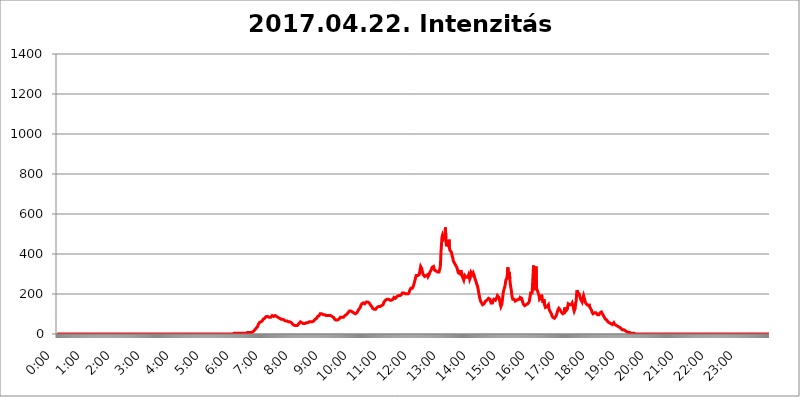
| Category | 2017.04.22. Intenzitás [W/m^2] |
|---|---|
| 0.0 | 0 |
| 0.0006944444444444445 | 0 |
| 0.001388888888888889 | 0 |
| 0.0020833333333333333 | 0 |
| 0.002777777777777778 | 0 |
| 0.003472222222222222 | 0 |
| 0.004166666666666667 | 0 |
| 0.004861111111111111 | 0 |
| 0.005555555555555556 | 0 |
| 0.0062499999999999995 | 0 |
| 0.006944444444444444 | 0 |
| 0.007638888888888889 | 0 |
| 0.008333333333333333 | 0 |
| 0.009027777777777779 | 0 |
| 0.009722222222222222 | 0 |
| 0.010416666666666666 | 0 |
| 0.011111111111111112 | 0 |
| 0.011805555555555555 | 0 |
| 0.012499999999999999 | 0 |
| 0.013194444444444444 | 0 |
| 0.013888888888888888 | 0 |
| 0.014583333333333332 | 0 |
| 0.015277777777777777 | 0 |
| 0.015972222222222224 | 0 |
| 0.016666666666666666 | 0 |
| 0.017361111111111112 | 0 |
| 0.018055555555555557 | 0 |
| 0.01875 | 0 |
| 0.019444444444444445 | 0 |
| 0.02013888888888889 | 0 |
| 0.020833333333333332 | 0 |
| 0.02152777777777778 | 0 |
| 0.022222222222222223 | 0 |
| 0.02291666666666667 | 0 |
| 0.02361111111111111 | 0 |
| 0.024305555555555556 | 0 |
| 0.024999999999999998 | 0 |
| 0.025694444444444447 | 0 |
| 0.02638888888888889 | 0 |
| 0.027083333333333334 | 0 |
| 0.027777777777777776 | 0 |
| 0.02847222222222222 | 0 |
| 0.029166666666666664 | 0 |
| 0.029861111111111113 | 0 |
| 0.030555555555555555 | 0 |
| 0.03125 | 0 |
| 0.03194444444444445 | 0 |
| 0.03263888888888889 | 0 |
| 0.03333333333333333 | 0 |
| 0.034027777777777775 | 0 |
| 0.034722222222222224 | 0 |
| 0.035416666666666666 | 0 |
| 0.036111111111111115 | 0 |
| 0.03680555555555556 | 0 |
| 0.0375 | 0 |
| 0.03819444444444444 | 0 |
| 0.03888888888888889 | 0 |
| 0.03958333333333333 | 0 |
| 0.04027777777777778 | 0 |
| 0.04097222222222222 | 0 |
| 0.041666666666666664 | 0 |
| 0.042361111111111106 | 0 |
| 0.04305555555555556 | 0 |
| 0.043750000000000004 | 0 |
| 0.044444444444444446 | 0 |
| 0.04513888888888889 | 0 |
| 0.04583333333333334 | 0 |
| 0.04652777777777778 | 0 |
| 0.04722222222222222 | 0 |
| 0.04791666666666666 | 0 |
| 0.04861111111111111 | 0 |
| 0.049305555555555554 | 0 |
| 0.049999999999999996 | 0 |
| 0.05069444444444445 | 0 |
| 0.051388888888888894 | 0 |
| 0.052083333333333336 | 0 |
| 0.05277777777777778 | 0 |
| 0.05347222222222222 | 0 |
| 0.05416666666666667 | 0 |
| 0.05486111111111111 | 0 |
| 0.05555555555555555 | 0 |
| 0.05625 | 0 |
| 0.05694444444444444 | 0 |
| 0.057638888888888885 | 0 |
| 0.05833333333333333 | 0 |
| 0.05902777777777778 | 0 |
| 0.059722222222222225 | 0 |
| 0.06041666666666667 | 0 |
| 0.061111111111111116 | 0 |
| 0.06180555555555556 | 0 |
| 0.0625 | 0 |
| 0.06319444444444444 | 0 |
| 0.06388888888888888 | 0 |
| 0.06458333333333334 | 0 |
| 0.06527777777777778 | 0 |
| 0.06597222222222222 | 0 |
| 0.06666666666666667 | 0 |
| 0.06736111111111111 | 0 |
| 0.06805555555555555 | 0 |
| 0.06874999999999999 | 0 |
| 0.06944444444444443 | 0 |
| 0.07013888888888889 | 0 |
| 0.07083333333333333 | 0 |
| 0.07152777777777779 | 0 |
| 0.07222222222222223 | 0 |
| 0.07291666666666667 | 0 |
| 0.07361111111111111 | 0 |
| 0.07430555555555556 | 0 |
| 0.075 | 0 |
| 0.07569444444444444 | 0 |
| 0.0763888888888889 | 0 |
| 0.07708333333333334 | 0 |
| 0.07777777777777778 | 0 |
| 0.07847222222222222 | 0 |
| 0.07916666666666666 | 0 |
| 0.0798611111111111 | 0 |
| 0.08055555555555556 | 0 |
| 0.08125 | 0 |
| 0.08194444444444444 | 0 |
| 0.08263888888888889 | 0 |
| 0.08333333333333333 | 0 |
| 0.08402777777777777 | 0 |
| 0.08472222222222221 | 0 |
| 0.08541666666666665 | 0 |
| 0.08611111111111112 | 0 |
| 0.08680555555555557 | 0 |
| 0.08750000000000001 | 0 |
| 0.08819444444444445 | 0 |
| 0.08888888888888889 | 0 |
| 0.08958333333333333 | 0 |
| 0.09027777777777778 | 0 |
| 0.09097222222222222 | 0 |
| 0.09166666666666667 | 0 |
| 0.09236111111111112 | 0 |
| 0.09305555555555556 | 0 |
| 0.09375 | 0 |
| 0.09444444444444444 | 0 |
| 0.09513888888888888 | 0 |
| 0.09583333333333333 | 0 |
| 0.09652777777777777 | 0 |
| 0.09722222222222222 | 0 |
| 0.09791666666666667 | 0 |
| 0.09861111111111111 | 0 |
| 0.09930555555555555 | 0 |
| 0.09999999999999999 | 0 |
| 0.10069444444444443 | 0 |
| 0.1013888888888889 | 0 |
| 0.10208333333333335 | 0 |
| 0.10277777777777779 | 0 |
| 0.10347222222222223 | 0 |
| 0.10416666666666667 | 0 |
| 0.10486111111111111 | 0 |
| 0.10555555555555556 | 0 |
| 0.10625 | 0 |
| 0.10694444444444444 | 0 |
| 0.1076388888888889 | 0 |
| 0.10833333333333334 | 0 |
| 0.10902777777777778 | 0 |
| 0.10972222222222222 | 0 |
| 0.1111111111111111 | 0 |
| 0.11180555555555556 | 0 |
| 0.11180555555555556 | 0 |
| 0.1125 | 0 |
| 0.11319444444444444 | 0 |
| 0.11388888888888889 | 0 |
| 0.11458333333333333 | 0 |
| 0.11527777777777777 | 0 |
| 0.11597222222222221 | 0 |
| 0.11666666666666665 | 0 |
| 0.1173611111111111 | 0 |
| 0.11805555555555557 | 0 |
| 0.11944444444444445 | 0 |
| 0.12013888888888889 | 0 |
| 0.12083333333333333 | 0 |
| 0.12152777777777778 | 0 |
| 0.12222222222222223 | 0 |
| 0.12291666666666667 | 0 |
| 0.12291666666666667 | 0 |
| 0.12361111111111112 | 0 |
| 0.12430555555555556 | 0 |
| 0.125 | 0 |
| 0.12569444444444444 | 0 |
| 0.12638888888888888 | 0 |
| 0.12708333333333333 | 0 |
| 0.16875 | 0 |
| 0.12847222222222224 | 0 |
| 0.12916666666666668 | 0 |
| 0.12986111111111112 | 0 |
| 0.13055555555555556 | 0 |
| 0.13125 | 0 |
| 0.13194444444444445 | 0 |
| 0.1326388888888889 | 0 |
| 0.13333333333333333 | 0 |
| 0.13402777777777777 | 0 |
| 0.13402777777777777 | 0 |
| 0.13472222222222222 | 0 |
| 0.13541666666666666 | 0 |
| 0.1361111111111111 | 0 |
| 0.13749999999999998 | 0 |
| 0.13819444444444443 | 0 |
| 0.1388888888888889 | 0 |
| 0.13958333333333334 | 0 |
| 0.14027777777777778 | 0 |
| 0.14097222222222222 | 0 |
| 0.14166666666666666 | 0 |
| 0.1423611111111111 | 0 |
| 0.14305555555555557 | 0 |
| 0.14375000000000002 | 0 |
| 0.14444444444444446 | 0 |
| 0.1451388888888889 | 0 |
| 0.1451388888888889 | 0 |
| 0.14652777777777778 | 0 |
| 0.14722222222222223 | 0 |
| 0.14791666666666667 | 0 |
| 0.1486111111111111 | 0 |
| 0.14930555555555555 | 0 |
| 0.15 | 0 |
| 0.15069444444444444 | 0 |
| 0.15138888888888888 | 0 |
| 0.15208333333333332 | 0 |
| 0.15277777777777776 | 0 |
| 0.15347222222222223 | 0 |
| 0.15416666666666667 | 0 |
| 0.15486111111111112 | 0 |
| 0.15555555555555556 | 0 |
| 0.15625 | 0 |
| 0.15694444444444444 | 0 |
| 0.15763888888888888 | 0 |
| 0.15833333333333333 | 0 |
| 0.15902777777777777 | 0 |
| 0.15972222222222224 | 0 |
| 0.16041666666666668 | 0 |
| 0.16111111111111112 | 0 |
| 0.16180555555555556 | 0 |
| 0.1625 | 0 |
| 0.16319444444444445 | 0 |
| 0.1638888888888889 | 0 |
| 0.16458333333333333 | 0 |
| 0.16527777777777777 | 0 |
| 0.16597222222222222 | 0 |
| 0.16666666666666666 | 0 |
| 0.1673611111111111 | 0 |
| 0.16805555555555554 | 0 |
| 0.16874999999999998 | 0 |
| 0.16944444444444443 | 0 |
| 0.17013888888888887 | 0 |
| 0.1708333333333333 | 0 |
| 0.17152777777777775 | 0 |
| 0.17222222222222225 | 0 |
| 0.1729166666666667 | 0 |
| 0.17361111111111113 | 0 |
| 0.17430555555555557 | 0 |
| 0.17500000000000002 | 0 |
| 0.17569444444444446 | 0 |
| 0.1763888888888889 | 0 |
| 0.17708333333333334 | 0 |
| 0.17777777777777778 | 0 |
| 0.17847222222222223 | 0 |
| 0.17916666666666667 | 0 |
| 0.1798611111111111 | 0 |
| 0.18055555555555555 | 0 |
| 0.18125 | 0 |
| 0.18194444444444444 | 0 |
| 0.1826388888888889 | 0 |
| 0.18333333333333335 | 0 |
| 0.1840277777777778 | 0 |
| 0.18472222222222223 | 0 |
| 0.18541666666666667 | 0 |
| 0.18611111111111112 | 0 |
| 0.18680555555555556 | 0 |
| 0.1875 | 0 |
| 0.18819444444444444 | 0 |
| 0.18888888888888888 | 0 |
| 0.18958333333333333 | 0 |
| 0.19027777777777777 | 0 |
| 0.1909722222222222 | 0 |
| 0.19166666666666665 | 0 |
| 0.19236111111111112 | 0 |
| 0.19305555555555554 | 0 |
| 0.19375 | 0 |
| 0.19444444444444445 | 0 |
| 0.1951388888888889 | 0 |
| 0.19583333333333333 | 0 |
| 0.19652777777777777 | 0 |
| 0.19722222222222222 | 0 |
| 0.19791666666666666 | 0 |
| 0.1986111111111111 | 0 |
| 0.19930555555555554 | 0 |
| 0.19999999999999998 | 0 |
| 0.20069444444444443 | 0 |
| 0.20138888888888887 | 0 |
| 0.2020833333333333 | 0 |
| 0.2027777777777778 | 0 |
| 0.2034722222222222 | 0 |
| 0.2041666666666667 | 0 |
| 0.20486111111111113 | 0 |
| 0.20555555555555557 | 0 |
| 0.20625000000000002 | 0 |
| 0.20694444444444446 | 0 |
| 0.2076388888888889 | 0 |
| 0.20833333333333334 | 0 |
| 0.20902777777777778 | 0 |
| 0.20972222222222223 | 0 |
| 0.21041666666666667 | 0 |
| 0.2111111111111111 | 0 |
| 0.21180555555555555 | 0 |
| 0.2125 | 0 |
| 0.21319444444444444 | 0 |
| 0.2138888888888889 | 0 |
| 0.21458333333333335 | 0 |
| 0.2152777777777778 | 0 |
| 0.21597222222222223 | 0 |
| 0.21666666666666667 | 0 |
| 0.21736111111111112 | 0 |
| 0.21805555555555556 | 0 |
| 0.21875 | 0 |
| 0.21944444444444444 | 0 |
| 0.22013888888888888 | 0 |
| 0.22083333333333333 | 0 |
| 0.22152777777777777 | 0 |
| 0.2222222222222222 | 0 |
| 0.22291666666666665 | 0 |
| 0.2236111111111111 | 0 |
| 0.22430555555555556 | 0 |
| 0.225 | 0 |
| 0.22569444444444445 | 0 |
| 0.2263888888888889 | 0 |
| 0.22708333333333333 | 0 |
| 0.22777777777777777 | 0 |
| 0.22847222222222222 | 0 |
| 0.22916666666666666 | 0 |
| 0.2298611111111111 | 0 |
| 0.23055555555555554 | 0 |
| 0.23124999999999998 | 0 |
| 0.23194444444444443 | 0 |
| 0.23263888888888887 | 0 |
| 0.2333333333333333 | 0 |
| 0.2340277777777778 | 0 |
| 0.2347222222222222 | 0 |
| 0.2354166666666667 | 0 |
| 0.23611111111111113 | 0 |
| 0.23680555555555557 | 0 |
| 0.23750000000000002 | 0 |
| 0.23819444444444446 | 0 |
| 0.2388888888888889 | 0 |
| 0.23958333333333334 | 0 |
| 0.24027777777777778 | 0 |
| 0.24097222222222223 | 0 |
| 0.24166666666666667 | 0 |
| 0.2423611111111111 | 0 |
| 0.24305555555555555 | 0 |
| 0.24375 | 0 |
| 0.24444444444444446 | 0 |
| 0.24513888888888888 | 0 |
| 0.24583333333333335 | 0 |
| 0.2465277777777778 | 3.525 |
| 0.24722222222222223 | 3.525 |
| 0.24791666666666667 | 3.525 |
| 0.24861111111111112 | 3.525 |
| 0.24930555555555556 | 3.525 |
| 0.25 | 3.525 |
| 0.25069444444444444 | 3.525 |
| 0.2513888888888889 | 3.525 |
| 0.2520833333333333 | 3.525 |
| 0.25277777777777777 | 3.525 |
| 0.2534722222222222 | 3.525 |
| 0.25416666666666665 | 3.525 |
| 0.2548611111111111 | 3.525 |
| 0.2555555555555556 | 3.525 |
| 0.25625000000000003 | 3.525 |
| 0.2569444444444445 | 3.525 |
| 0.2576388888888889 | 3.525 |
| 0.25833333333333336 | 3.525 |
| 0.2590277777777778 | 3.525 |
| 0.25972222222222224 | 3.525 |
| 0.2604166666666667 | 3.525 |
| 0.2611111111111111 | 3.525 |
| 0.26180555555555557 | 3.525 |
| 0.2625 | 3.525 |
| 0.26319444444444445 | 7.887 |
| 0.2638888888888889 | 7.887 |
| 0.26458333333333334 | 3.525 |
| 0.2652777777777778 | 7.887 |
| 0.2659722222222222 | 7.887 |
| 0.26666666666666666 | 7.887 |
| 0.2673611111111111 | 7.887 |
| 0.26805555555555555 | 7.887 |
| 0.26875 | 7.887 |
| 0.26944444444444443 | 7.887 |
| 0.2701388888888889 | 7.887 |
| 0.2708333333333333 | 7.887 |
| 0.27152777777777776 | 7.887 |
| 0.2722222222222222 | 7.887 |
| 0.27291666666666664 | 7.887 |
| 0.2736111111111111 | 12.257 |
| 0.2743055555555555 | 12.257 |
| 0.27499999999999997 | 12.257 |
| 0.27569444444444446 | 12.257 |
| 0.27638888888888885 | 16.636 |
| 0.27708333333333335 | 21.024 |
| 0.2777777777777778 | 25.419 |
| 0.27847222222222223 | 25.419 |
| 0.2791666666666667 | 29.823 |
| 0.2798611111111111 | 34.234 |
| 0.28055555555555556 | 34.234 |
| 0.28125 | 38.653 |
| 0.28194444444444444 | 47.511 |
| 0.2826388888888889 | 51.951 |
| 0.2833333333333333 | 56.398 |
| 0.28402777777777777 | 56.398 |
| 0.2847222222222222 | 56.398 |
| 0.28541666666666665 | 60.85 |
| 0.28611111111111115 | 60.85 |
| 0.28680555555555554 | 60.85 |
| 0.28750000000000003 | 65.31 |
| 0.2881944444444445 | 65.31 |
| 0.2888888888888889 | 74.246 |
| 0.28958333333333336 | 74.246 |
| 0.2902777777777778 | 74.246 |
| 0.29097222222222224 | 78.722 |
| 0.2916666666666667 | 83.205 |
| 0.2923611111111111 | 83.205 |
| 0.29305555555555557 | 87.692 |
| 0.29375 | 87.692 |
| 0.29444444444444445 | 87.692 |
| 0.2951388888888889 | 87.692 |
| 0.29583333333333334 | 87.692 |
| 0.2965277777777778 | 83.205 |
| 0.2972222222222222 | 83.205 |
| 0.29791666666666666 | 83.205 |
| 0.2986111111111111 | 83.205 |
| 0.29930555555555555 | 83.205 |
| 0.3 | 87.692 |
| 0.30069444444444443 | 87.692 |
| 0.3013888888888889 | 92.184 |
| 0.3020833333333333 | 87.692 |
| 0.30277777777777776 | 87.692 |
| 0.3034722222222222 | 87.692 |
| 0.30416666666666664 | 87.692 |
| 0.3048611111111111 | 87.692 |
| 0.3055555555555555 | 92.184 |
| 0.30624999999999997 | 87.692 |
| 0.3069444444444444 | 87.692 |
| 0.3076388888888889 | 87.692 |
| 0.30833333333333335 | 83.205 |
| 0.3090277777777778 | 83.205 |
| 0.30972222222222223 | 83.205 |
| 0.3104166666666667 | 83.205 |
| 0.3111111111111111 | 83.205 |
| 0.31180555555555556 | 78.722 |
| 0.3125 | 78.722 |
| 0.31319444444444444 | 78.722 |
| 0.3138888888888889 | 74.246 |
| 0.3145833333333333 | 74.246 |
| 0.31527777777777777 | 74.246 |
| 0.3159722222222222 | 74.246 |
| 0.31666666666666665 | 74.246 |
| 0.31736111111111115 | 74.246 |
| 0.31805555555555554 | 69.775 |
| 0.31875000000000003 | 65.31 |
| 0.3194444444444445 | 65.31 |
| 0.3201388888888889 | 65.31 |
| 0.32083333333333336 | 65.31 |
| 0.3215277777777778 | 65.31 |
| 0.32222222222222224 | 65.31 |
| 0.3229166666666667 | 65.31 |
| 0.3236111111111111 | 60.85 |
| 0.32430555555555557 | 60.85 |
| 0.325 | 60.85 |
| 0.32569444444444445 | 60.85 |
| 0.3263888888888889 | 60.85 |
| 0.32708333333333334 | 60.85 |
| 0.3277777777777778 | 60.85 |
| 0.3284722222222222 | 56.398 |
| 0.32916666666666666 | 56.398 |
| 0.3298611111111111 | 51.951 |
| 0.33055555555555555 | 47.511 |
| 0.33125 | 47.511 |
| 0.33194444444444443 | 43.079 |
| 0.3326388888888889 | 43.079 |
| 0.3333333333333333 | 43.079 |
| 0.3340277777777778 | 43.079 |
| 0.3347222222222222 | 43.079 |
| 0.3354166666666667 | 43.079 |
| 0.3361111111111111 | 43.079 |
| 0.3368055555555556 | 43.079 |
| 0.33749999999999997 | 47.511 |
| 0.33819444444444446 | 47.511 |
| 0.33888888888888885 | 51.951 |
| 0.33958333333333335 | 56.398 |
| 0.34027777777777773 | 56.398 |
| 0.34097222222222223 | 60.85 |
| 0.3416666666666666 | 60.85 |
| 0.3423611111111111 | 60.85 |
| 0.3430555555555555 | 56.398 |
| 0.34375 | 56.398 |
| 0.3444444444444445 | 51.951 |
| 0.3451388888888889 | 51.951 |
| 0.3458333333333334 | 47.511 |
| 0.34652777777777777 | 47.511 |
| 0.34722222222222227 | 51.951 |
| 0.34791666666666665 | 51.951 |
| 0.34861111111111115 | 56.398 |
| 0.34930555555555554 | 56.398 |
| 0.35000000000000003 | 56.398 |
| 0.3506944444444444 | 56.398 |
| 0.3513888888888889 | 56.398 |
| 0.3520833333333333 | 56.398 |
| 0.3527777777777778 | 56.398 |
| 0.3534722222222222 | 60.85 |
| 0.3541666666666667 | 60.85 |
| 0.3548611111111111 | 60.85 |
| 0.35555555555555557 | 60.85 |
| 0.35625 | 60.85 |
| 0.35694444444444445 | 60.85 |
| 0.3576388888888889 | 60.85 |
| 0.35833333333333334 | 60.85 |
| 0.3590277777777778 | 65.31 |
| 0.3597222222222222 | 65.31 |
| 0.36041666666666666 | 69.775 |
| 0.3611111111111111 | 69.775 |
| 0.36180555555555555 | 74.246 |
| 0.3625 | 74.246 |
| 0.36319444444444443 | 74.246 |
| 0.3638888888888889 | 78.722 |
| 0.3645833333333333 | 83.205 |
| 0.3652777777777778 | 87.692 |
| 0.3659722222222222 | 87.692 |
| 0.3666666666666667 | 92.184 |
| 0.3673611111111111 | 92.184 |
| 0.3680555555555556 | 96.682 |
| 0.36874999999999997 | 101.184 |
| 0.36944444444444446 | 101.184 |
| 0.37013888888888885 | 101.184 |
| 0.37083333333333335 | 101.184 |
| 0.37152777777777773 | 96.682 |
| 0.37222222222222223 | 96.682 |
| 0.3729166666666666 | 96.682 |
| 0.3736111111111111 | 96.682 |
| 0.3743055555555555 | 96.682 |
| 0.375 | 96.682 |
| 0.3756944444444445 | 96.682 |
| 0.3763888888888889 | 92.184 |
| 0.3770833333333334 | 92.184 |
| 0.37777777777777777 | 92.184 |
| 0.37847222222222227 | 92.184 |
| 0.37916666666666665 | 92.184 |
| 0.37986111111111115 | 92.184 |
| 0.38055555555555554 | 92.184 |
| 0.38125000000000003 | 92.184 |
| 0.3819444444444444 | 92.184 |
| 0.3826388888888889 | 92.184 |
| 0.3833333333333333 | 92.184 |
| 0.3840277777777778 | 87.692 |
| 0.3847222222222222 | 87.692 |
| 0.3854166666666667 | 87.692 |
| 0.3861111111111111 | 83.205 |
| 0.38680555555555557 | 83.205 |
| 0.3875 | 83.205 |
| 0.38819444444444445 | 78.722 |
| 0.3888888888888889 | 74.246 |
| 0.38958333333333334 | 74.246 |
| 0.3902777777777778 | 74.246 |
| 0.3909722222222222 | 69.775 |
| 0.39166666666666666 | 69.775 |
| 0.3923611111111111 | 69.775 |
| 0.39305555555555555 | 69.775 |
| 0.39375 | 74.246 |
| 0.39444444444444443 | 74.246 |
| 0.3951388888888889 | 74.246 |
| 0.3958333333333333 | 78.722 |
| 0.3965277777777778 | 78.722 |
| 0.3972222222222222 | 83.205 |
| 0.3979166666666667 | 83.205 |
| 0.3986111111111111 | 83.205 |
| 0.3993055555555556 | 83.205 |
| 0.39999999999999997 | 83.205 |
| 0.40069444444444446 | 83.205 |
| 0.40138888888888885 | 83.205 |
| 0.40208333333333335 | 83.205 |
| 0.40277777777777773 | 87.692 |
| 0.40347222222222223 | 92.184 |
| 0.4041666666666666 | 92.184 |
| 0.4048611111111111 | 92.184 |
| 0.4055555555555555 | 96.682 |
| 0.40625 | 101.184 |
| 0.4069444444444445 | 101.184 |
| 0.4076388888888889 | 105.69 |
| 0.4083333333333334 | 105.69 |
| 0.40902777777777777 | 110.201 |
| 0.40972222222222227 | 114.716 |
| 0.41041666666666665 | 114.716 |
| 0.41111111111111115 | 114.716 |
| 0.41180555555555554 | 114.716 |
| 0.41250000000000003 | 110.201 |
| 0.4131944444444444 | 110.201 |
| 0.4138888888888889 | 110.201 |
| 0.4145833333333333 | 110.201 |
| 0.4152777777777778 | 110.201 |
| 0.4159722222222222 | 105.69 |
| 0.4166666666666667 | 105.69 |
| 0.4173611111111111 | 101.184 |
| 0.41805555555555557 | 101.184 |
| 0.41875 | 101.184 |
| 0.41944444444444445 | 101.184 |
| 0.4201388888888889 | 105.69 |
| 0.42083333333333334 | 110.201 |
| 0.4215277777777778 | 114.716 |
| 0.4222222222222222 | 119.235 |
| 0.42291666666666666 | 123.758 |
| 0.4236111111111111 | 128.284 |
| 0.42430555555555555 | 128.284 |
| 0.425 | 132.814 |
| 0.42569444444444443 | 141.884 |
| 0.4263888888888889 | 146.423 |
| 0.4270833333333333 | 150.964 |
| 0.4277777777777778 | 155.509 |
| 0.4284722222222222 | 155.509 |
| 0.4291666666666667 | 155.509 |
| 0.4298611111111111 | 150.964 |
| 0.4305555555555556 | 150.964 |
| 0.43124999999999997 | 150.964 |
| 0.43194444444444446 | 150.964 |
| 0.43263888888888885 | 155.509 |
| 0.43333333333333335 | 160.056 |
| 0.43402777777777773 | 160.056 |
| 0.43472222222222223 | 160.056 |
| 0.4354166666666666 | 160.056 |
| 0.4361111111111111 | 160.056 |
| 0.4368055555555555 | 155.509 |
| 0.4375 | 155.509 |
| 0.4381944444444445 | 150.964 |
| 0.4388888888888889 | 146.423 |
| 0.4395833333333334 | 141.884 |
| 0.44027777777777777 | 141.884 |
| 0.44097222222222227 | 137.347 |
| 0.44166666666666665 | 132.814 |
| 0.44236111111111115 | 128.284 |
| 0.44305555555555554 | 123.758 |
| 0.44375000000000003 | 123.758 |
| 0.4444444444444444 | 123.758 |
| 0.4451388888888889 | 123.758 |
| 0.4458333333333333 | 119.235 |
| 0.4465277777777778 | 123.758 |
| 0.4472222222222222 | 123.758 |
| 0.4479166666666667 | 128.284 |
| 0.4486111111111111 | 132.814 |
| 0.44930555555555557 | 132.814 |
| 0.45 | 137.347 |
| 0.45069444444444445 | 137.347 |
| 0.4513888888888889 | 137.347 |
| 0.45208333333333334 | 137.347 |
| 0.4527777777777778 | 137.347 |
| 0.4534722222222222 | 137.347 |
| 0.45416666666666666 | 141.884 |
| 0.4548611111111111 | 141.884 |
| 0.45555555555555555 | 146.423 |
| 0.45625 | 146.423 |
| 0.45694444444444443 | 146.423 |
| 0.4576388888888889 | 150.964 |
| 0.4583333333333333 | 160.056 |
| 0.4590277777777778 | 164.605 |
| 0.4597222222222222 | 164.605 |
| 0.4604166666666667 | 169.156 |
| 0.4611111111111111 | 173.709 |
| 0.4618055555555556 | 173.709 |
| 0.46249999999999997 | 173.709 |
| 0.46319444444444446 | 173.709 |
| 0.46388888888888885 | 173.709 |
| 0.46458333333333335 | 173.709 |
| 0.46527777777777773 | 173.709 |
| 0.46597222222222223 | 169.156 |
| 0.4666666666666666 | 169.156 |
| 0.4673611111111111 | 169.156 |
| 0.4680555555555555 | 169.156 |
| 0.46875 | 169.156 |
| 0.4694444444444445 | 169.156 |
| 0.4701388888888889 | 173.709 |
| 0.4708333333333334 | 173.709 |
| 0.47152777777777777 | 178.264 |
| 0.47222222222222227 | 182.82 |
| 0.47291666666666665 | 182.82 |
| 0.47361111111111115 | 182.82 |
| 0.47430555555555554 | 178.264 |
| 0.47500000000000003 | 178.264 |
| 0.4756944444444444 | 182.82 |
| 0.4763888888888889 | 187.378 |
| 0.4770833333333333 | 191.937 |
| 0.4777777777777778 | 191.937 |
| 0.4784722222222222 | 191.937 |
| 0.4791666666666667 | 191.937 |
| 0.4798611111111111 | 191.937 |
| 0.48055555555555557 | 191.937 |
| 0.48125 | 191.937 |
| 0.48194444444444445 | 196.497 |
| 0.4826388888888889 | 196.497 |
| 0.48333333333333334 | 201.058 |
| 0.4840277777777778 | 205.62 |
| 0.4847222222222222 | 205.62 |
| 0.48541666666666666 | 205.62 |
| 0.4861111111111111 | 205.62 |
| 0.48680555555555555 | 205.62 |
| 0.4875 | 201.058 |
| 0.48819444444444443 | 201.058 |
| 0.4888888888888889 | 201.058 |
| 0.4895833333333333 | 201.058 |
| 0.4902777777777778 | 201.058 |
| 0.4909722222222222 | 201.058 |
| 0.4916666666666667 | 201.058 |
| 0.4923611111111111 | 201.058 |
| 0.4930555555555556 | 205.62 |
| 0.49374999999999997 | 210.182 |
| 0.49444444444444446 | 219.309 |
| 0.49513888888888885 | 223.873 |
| 0.49583333333333335 | 228.436 |
| 0.49652777777777773 | 228.436 |
| 0.49722222222222223 | 228.436 |
| 0.4979166666666666 | 228.436 |
| 0.4986111111111111 | 228.436 |
| 0.4993055555555555 | 237.564 |
| 0.5 | 246.689 |
| 0.5006944444444444 | 255.813 |
| 0.5013888888888889 | 264.932 |
| 0.5020833333333333 | 274.047 |
| 0.5027777777777778 | 283.156 |
| 0.5034722222222222 | 292.259 |
| 0.5041666666666667 | 296.808 |
| 0.5048611111111111 | 296.808 |
| 0.5055555555555555 | 292.259 |
| 0.50625 | 287.709 |
| 0.5069444444444444 | 292.259 |
| 0.5076388888888889 | 296.808 |
| 0.5083333333333333 | 310.44 |
| 0.5090277777777777 | 324.052 |
| 0.5097222222222222 | 337.639 |
| 0.5104166666666666 | 342.162 |
| 0.5111111111111112 | 328.584 |
| 0.5118055555555555 | 314.98 |
| 0.5125000000000001 | 305.898 |
| 0.5131944444444444 | 296.808 |
| 0.513888888888889 | 292.259 |
| 0.5145833333333333 | 292.259 |
| 0.5152777777777778 | 287.709 |
| 0.5159722222222222 | 287.709 |
| 0.5166666666666667 | 292.259 |
| 0.517361111111111 | 292.259 |
| 0.5180555555555556 | 292.259 |
| 0.5187499999999999 | 296.808 |
| 0.5194444444444445 | 296.808 |
| 0.5201388888888888 | 287.709 |
| 0.5208333333333334 | 287.709 |
| 0.5215277777777778 | 296.808 |
| 0.5222222222222223 | 305.898 |
| 0.5229166666666667 | 310.44 |
| 0.5236111111111111 | 314.98 |
| 0.5243055555555556 | 319.517 |
| 0.525 | 324.052 |
| 0.5256944444444445 | 333.113 |
| 0.5263888888888889 | 333.113 |
| 0.5270833333333333 | 333.113 |
| 0.5277777777777778 | 337.639 |
| 0.5284722222222222 | 328.584 |
| 0.5291666666666667 | 319.517 |
| 0.5298611111111111 | 314.98 |
| 0.5305555555555556 | 314.98 |
| 0.53125 | 314.98 |
| 0.5319444444444444 | 310.44 |
| 0.5326388888888889 | 310.44 |
| 0.5333333333333333 | 310.44 |
| 0.5340277777777778 | 310.44 |
| 0.5347222222222222 | 310.44 |
| 0.5354166666666667 | 310.44 |
| 0.5361111111111111 | 319.517 |
| 0.5368055555555555 | 328.584 |
| 0.5375 | 346.682 |
| 0.5381944444444444 | 409.574 |
| 0.5388888888888889 | 445.129 |
| 0.5395833333333333 | 484.735 |
| 0.5402777777777777 | 493.475 |
| 0.5409722222222222 | 484.735 |
| 0.5416666666666666 | 497.836 |
| 0.5423611111111112 | 484.735 |
| 0.5430555555555555 | 480.356 |
| 0.5437500000000001 | 497.836 |
| 0.5444444444444444 | 532.513 |
| 0.545138888888889 | 462.786 |
| 0.5458333333333333 | 445.129 |
| 0.5465277777777778 | 440.702 |
| 0.5472222222222222 | 440.702 |
| 0.5479166666666667 | 445.129 |
| 0.548611111111111 | 436.27 |
| 0.5493055555555556 | 471.582 |
| 0.5499999999999999 | 431.833 |
| 0.5506944444444445 | 418.492 |
| 0.5513888888888888 | 418.492 |
| 0.5520833333333334 | 414.035 |
| 0.5527777777777778 | 409.574 |
| 0.5534722222222223 | 405.108 |
| 0.5541666666666667 | 387.202 |
| 0.5548611111111111 | 378.224 |
| 0.5555555555555556 | 364.728 |
| 0.55625 | 360.221 |
| 0.5569444444444445 | 355.712 |
| 0.5576388888888889 | 351.198 |
| 0.5583333333333333 | 346.682 |
| 0.5590277777777778 | 346.682 |
| 0.5597222222222222 | 342.162 |
| 0.5604166666666667 | 333.113 |
| 0.5611111111111111 | 324.052 |
| 0.5618055555555556 | 314.98 |
| 0.5625 | 305.898 |
| 0.5631944444444444 | 301.354 |
| 0.5638888888888889 | 301.354 |
| 0.5645833333333333 | 301.354 |
| 0.5652777777777778 | 296.808 |
| 0.5659722222222222 | 319.517 |
| 0.5666666666666667 | 314.98 |
| 0.5673611111111111 | 296.808 |
| 0.5680555555555555 | 287.709 |
| 0.56875 | 287.709 |
| 0.5694444444444444 | 287.709 |
| 0.5701388888888889 | 269.49 |
| 0.5708333333333333 | 274.047 |
| 0.5715277777777777 | 292.259 |
| 0.5722222222222222 | 296.808 |
| 0.5729166666666666 | 287.709 |
| 0.5736111111111112 | 283.156 |
| 0.5743055555555555 | 287.709 |
| 0.5750000000000001 | 287.709 |
| 0.5756944444444444 | 283.156 |
| 0.576388888888889 | 287.709 |
| 0.5770833333333333 | 296.808 |
| 0.5777777777777778 | 287.709 |
| 0.5784722222222222 | 274.047 |
| 0.5791666666666667 | 269.49 |
| 0.579861111111111 | 287.709 |
| 0.5805555555555556 | 305.898 |
| 0.5812499999999999 | 305.898 |
| 0.5819444444444445 | 296.808 |
| 0.5826388888888888 | 301.354 |
| 0.5833333333333334 | 305.898 |
| 0.5840277777777778 | 301.354 |
| 0.5847222222222223 | 292.259 |
| 0.5854166666666667 | 283.156 |
| 0.5861111111111111 | 274.047 |
| 0.5868055555555556 | 269.49 |
| 0.5875 | 260.373 |
| 0.5881944444444445 | 251.251 |
| 0.5888888888888889 | 246.689 |
| 0.5895833333333333 | 237.564 |
| 0.5902777777777778 | 223.873 |
| 0.5909722222222222 | 210.182 |
| 0.5916666666666667 | 196.497 |
| 0.5923611111111111 | 182.82 |
| 0.5930555555555556 | 173.709 |
| 0.59375 | 164.605 |
| 0.5944444444444444 | 160.056 |
| 0.5951388888888889 | 155.509 |
| 0.5958333333333333 | 150.964 |
| 0.5965277777777778 | 146.423 |
| 0.5972222222222222 | 150.964 |
| 0.5979166666666667 | 150.964 |
| 0.5986111111111111 | 150.964 |
| 0.5993055555555555 | 155.509 |
| 0.6 | 155.509 |
| 0.6006944444444444 | 164.605 |
| 0.6013888888888889 | 164.605 |
| 0.6020833333333333 | 169.156 |
| 0.6027777777777777 | 169.156 |
| 0.6034722222222222 | 169.156 |
| 0.6041666666666666 | 173.709 |
| 0.6048611111111112 | 178.264 |
| 0.6055555555555555 | 182.82 |
| 0.6062500000000001 | 178.264 |
| 0.6069444444444444 | 173.709 |
| 0.607638888888889 | 164.605 |
| 0.6083333333333333 | 155.509 |
| 0.6090277777777778 | 150.964 |
| 0.6097222222222222 | 150.964 |
| 0.6104166666666667 | 155.509 |
| 0.611111111111111 | 164.605 |
| 0.6118055555555556 | 169.156 |
| 0.6124999999999999 | 173.709 |
| 0.6131944444444445 | 173.709 |
| 0.6138888888888888 | 169.156 |
| 0.6145833333333334 | 169.156 |
| 0.6152777777777778 | 173.709 |
| 0.6159722222222223 | 178.264 |
| 0.6166666666666667 | 182.82 |
| 0.6173611111111111 | 191.937 |
| 0.6180555555555556 | 196.497 |
| 0.61875 | 191.937 |
| 0.6194444444444445 | 182.82 |
| 0.6201388888888889 | 173.709 |
| 0.6208333333333333 | 160.056 |
| 0.6215277777777778 | 146.423 |
| 0.6222222222222222 | 137.347 |
| 0.6229166666666667 | 137.347 |
| 0.6236111111111111 | 150.964 |
| 0.6243055555555556 | 169.156 |
| 0.625 | 191.937 |
| 0.6256944444444444 | 210.182 |
| 0.6263888888888889 | 219.309 |
| 0.6270833333333333 | 223.873 |
| 0.6277777777777778 | 237.564 |
| 0.6284722222222222 | 251.251 |
| 0.6291666666666667 | 269.49 |
| 0.6298611111111111 | 264.932 |
| 0.6305555555555555 | 278.603 |
| 0.63125 | 296.808 |
| 0.6319444444444444 | 333.113 |
| 0.6326388888888889 | 305.898 |
| 0.6333333333333333 | 296.808 |
| 0.6340277777777777 | 310.44 |
| 0.6347222222222222 | 274.047 |
| 0.6354166666666666 | 251.251 |
| 0.6361111111111112 | 233 |
| 0.6368055555555555 | 219.309 |
| 0.6375000000000001 | 196.497 |
| 0.6381944444444444 | 182.82 |
| 0.638888888888889 | 173.709 |
| 0.6395833333333333 | 169.156 |
| 0.6402777777777778 | 169.156 |
| 0.6409722222222222 | 173.709 |
| 0.6416666666666667 | 169.156 |
| 0.642361111111111 | 164.605 |
| 0.6430555555555556 | 164.605 |
| 0.6437499999999999 | 164.605 |
| 0.6444444444444445 | 169.156 |
| 0.6451388888888888 | 169.156 |
| 0.6458333333333334 | 173.709 |
| 0.6465277777777778 | 173.709 |
| 0.6472222222222223 | 173.709 |
| 0.6479166666666667 | 173.709 |
| 0.6486111111111111 | 173.709 |
| 0.6493055555555556 | 182.82 |
| 0.65 | 182.82 |
| 0.6506944444444445 | 182.82 |
| 0.6513888888888889 | 178.264 |
| 0.6520833333333333 | 169.156 |
| 0.6527777777777778 | 160.056 |
| 0.6534722222222222 | 150.964 |
| 0.6541666666666667 | 146.423 |
| 0.6548611111111111 | 146.423 |
| 0.6555555555555556 | 141.884 |
| 0.65625 | 146.423 |
| 0.6569444444444444 | 146.423 |
| 0.6576388888888889 | 146.423 |
| 0.6583333333333333 | 146.423 |
| 0.6590277777777778 | 146.423 |
| 0.6597222222222222 | 150.964 |
| 0.6604166666666667 | 150.964 |
| 0.6611111111111111 | 155.509 |
| 0.6618055555555555 | 160.056 |
| 0.6625 | 173.709 |
| 0.6631944444444444 | 187.378 |
| 0.6638888888888889 | 205.62 |
| 0.6645833333333333 | 201.058 |
| 0.6652777777777777 | 201.058 |
| 0.6659722222222222 | 205.62 |
| 0.6666666666666666 | 205.62 |
| 0.6673611111111111 | 205.62 |
| 0.6680555555555556 | 342.162 |
| 0.6687500000000001 | 219.309 |
| 0.6694444444444444 | 228.436 |
| 0.6701388888888888 | 233 |
| 0.6708333333333334 | 228.436 |
| 0.6715277777777778 | 337.639 |
| 0.6722222222222222 | 228.436 |
| 0.6729166666666666 | 228.436 |
| 0.6736111111111112 | 214.746 |
| 0.6743055555555556 | 214.746 |
| 0.6749999999999999 | 210.182 |
| 0.6756944444444444 | 191.937 |
| 0.6763888888888889 | 173.709 |
| 0.6770833333333334 | 169.156 |
| 0.6777777777777777 | 169.156 |
| 0.6784722222222223 | 182.82 |
| 0.6791666666666667 | 196.497 |
| 0.6798611111111111 | 187.378 |
| 0.6805555555555555 | 169.156 |
| 0.68125 | 155.509 |
| 0.6819444444444445 | 155.509 |
| 0.6826388888888889 | 173.709 |
| 0.6833333333333332 | 146.423 |
| 0.6840277777777778 | 146.423 |
| 0.6847222222222222 | 132.814 |
| 0.6854166666666667 | 137.347 |
| 0.686111111111111 | 137.347 |
| 0.6868055555555556 | 137.347 |
| 0.6875 | 141.884 |
| 0.6881944444444444 | 141.884 |
| 0.688888888888889 | 146.423 |
| 0.6895833333333333 | 128.284 |
| 0.6902777777777778 | 119.235 |
| 0.6909722222222222 | 114.716 |
| 0.6916666666666668 | 110.201 |
| 0.6923611111111111 | 110.201 |
| 0.6930555555555555 | 101.184 |
| 0.69375 | 92.184 |
| 0.6944444444444445 | 87.692 |
| 0.6951388888888889 | 83.205 |
| 0.6958333333333333 | 83.205 |
| 0.6965277777777777 | 78.722 |
| 0.6972222222222223 | 78.722 |
| 0.6979166666666666 | 78.722 |
| 0.6986111111111111 | 83.205 |
| 0.6993055555555556 | 87.692 |
| 0.7000000000000001 | 92.184 |
| 0.7006944444444444 | 101.184 |
| 0.7013888888888888 | 105.69 |
| 0.7020833333333334 | 119.235 |
| 0.7027777777777778 | 123.758 |
| 0.7034722222222222 | 128.284 |
| 0.7041666666666666 | 128.284 |
| 0.7048611111111112 | 123.758 |
| 0.7055555555555556 | 119.235 |
| 0.7062499999999999 | 114.716 |
| 0.7069444444444444 | 110.201 |
| 0.7076388888888889 | 110.201 |
| 0.7083333333333334 | 105.69 |
| 0.7090277777777777 | 101.184 |
| 0.7097222222222223 | 101.184 |
| 0.7104166666666667 | 96.682 |
| 0.7111111111111111 | 105.69 |
| 0.7118055555555555 | 132.814 |
| 0.7125 | 132.814 |
| 0.7131944444444445 | 114.716 |
| 0.7138888888888889 | 110.201 |
| 0.7145833333333332 | 119.235 |
| 0.7152777777777778 | 123.758 |
| 0.7159722222222222 | 137.347 |
| 0.7166666666666667 | 150.964 |
| 0.717361111111111 | 155.509 |
| 0.7180555555555556 | 150.964 |
| 0.71875 | 146.423 |
| 0.7194444444444444 | 150.964 |
| 0.720138888888889 | 146.423 |
| 0.7208333333333333 | 146.423 |
| 0.7215277777777778 | 150.964 |
| 0.7222222222222222 | 155.509 |
| 0.7229166666666668 | 150.964 |
| 0.7236111111111111 | 137.347 |
| 0.7243055555555555 | 123.758 |
| 0.725 | 114.716 |
| 0.7256944444444445 | 119.235 |
| 0.7263888888888889 | 128.284 |
| 0.7270833333333333 | 155.509 |
| 0.7277777777777777 | 164.605 |
| 0.7284722222222223 | 201.058 |
| 0.7291666666666666 | 219.309 |
| 0.7298611111111111 | 205.62 |
| 0.7305555555555556 | 210.182 |
| 0.7312500000000001 | 205.62 |
| 0.7319444444444444 | 201.058 |
| 0.7326388888888888 | 191.937 |
| 0.7333333333333334 | 182.82 |
| 0.7340277777777778 | 173.709 |
| 0.7347222222222222 | 173.709 |
| 0.7354166666666666 | 178.264 |
| 0.7361111111111112 | 160.056 |
| 0.7368055555555556 | 155.509 |
| 0.7374999999999999 | 182.82 |
| 0.7381944444444444 | 191.937 |
| 0.7388888888888889 | 182.82 |
| 0.7395833333333334 | 173.709 |
| 0.7402777777777777 | 164.605 |
| 0.7409722222222223 | 155.509 |
| 0.7416666666666667 | 150.964 |
| 0.7423611111111111 | 150.964 |
| 0.7430555555555555 | 146.423 |
| 0.74375 | 150.964 |
| 0.7444444444444445 | 150.964 |
| 0.7451388888888889 | 141.884 |
| 0.7458333333333332 | 150.964 |
| 0.7465277777777778 | 137.347 |
| 0.7472222222222222 | 132.814 |
| 0.7479166666666667 | 128.284 |
| 0.748611111111111 | 123.758 |
| 0.7493055555555556 | 119.235 |
| 0.75 | 110.201 |
| 0.7506944444444444 | 105.69 |
| 0.751388888888889 | 101.184 |
| 0.7520833333333333 | 101.184 |
| 0.7527777777777778 | 101.184 |
| 0.7534722222222222 | 105.69 |
| 0.7541666666666668 | 110.201 |
| 0.7548611111111111 | 110.201 |
| 0.7555555555555555 | 105.69 |
| 0.75625 | 101.184 |
| 0.7569444444444445 | 101.184 |
| 0.7576388888888889 | 96.682 |
| 0.7583333333333333 | 96.682 |
| 0.7590277777777777 | 96.682 |
| 0.7597222222222223 | 96.682 |
| 0.7604166666666666 | 101.184 |
| 0.7611111111111111 | 105.69 |
| 0.7618055555555556 | 110.201 |
| 0.7625000000000001 | 110.201 |
| 0.7631944444444444 | 110.201 |
| 0.7638888888888888 | 105.69 |
| 0.7645833333333334 | 101.184 |
| 0.7652777777777778 | 96.682 |
| 0.7659722222222222 | 92.184 |
| 0.7666666666666666 | 87.692 |
| 0.7673611111111112 | 83.205 |
| 0.7680555555555556 | 78.722 |
| 0.7687499999999999 | 74.246 |
| 0.7694444444444444 | 74.246 |
| 0.7701388888888889 | 74.246 |
| 0.7708333333333334 | 69.775 |
| 0.7715277777777777 | 65.31 |
| 0.7722222222222223 | 60.85 |
| 0.7729166666666667 | 56.398 |
| 0.7736111111111111 | 56.398 |
| 0.7743055555555555 | 56.398 |
| 0.775 | 56.398 |
| 0.7756944444444445 | 51.951 |
| 0.7763888888888889 | 51.951 |
| 0.7770833333333332 | 47.511 |
| 0.7777777777777778 | 47.511 |
| 0.7784722222222222 | 47.511 |
| 0.7791666666666667 | 51.951 |
| 0.779861111111111 | 51.951 |
| 0.7805555555555556 | 56.398 |
| 0.78125 | 51.951 |
| 0.7819444444444444 | 47.511 |
| 0.782638888888889 | 47.511 |
| 0.7833333333333333 | 43.079 |
| 0.7840277777777778 | 43.079 |
| 0.7847222222222222 | 43.079 |
| 0.7854166666666668 | 38.653 |
| 0.7861111111111111 | 38.653 |
| 0.7868055555555555 | 34.234 |
| 0.7875 | 34.234 |
| 0.7881944444444445 | 34.234 |
| 0.7888888888888889 | 29.823 |
| 0.7895833333333333 | 29.823 |
| 0.7902777777777777 | 29.823 |
| 0.7909722222222223 | 25.419 |
| 0.7916666666666666 | 25.419 |
| 0.7923611111111111 | 21.024 |
| 0.7930555555555556 | 21.024 |
| 0.7937500000000001 | 21.024 |
| 0.7944444444444444 | 21.024 |
| 0.7951388888888888 | 21.024 |
| 0.7958333333333334 | 21.024 |
| 0.7965277777777778 | 16.636 |
| 0.7972222222222222 | 16.636 |
| 0.7979166666666666 | 12.257 |
| 0.7986111111111112 | 12.257 |
| 0.7993055555555556 | 7.887 |
| 0.7999999999999999 | 7.887 |
| 0.8006944444444444 | 7.887 |
| 0.8013888888888889 | 7.887 |
| 0.8020833333333334 | 3.525 |
| 0.8027777777777777 | 7.887 |
| 0.8034722222222223 | 3.525 |
| 0.8041666666666667 | 3.525 |
| 0.8048611111111111 | 3.525 |
| 0.8055555555555555 | 3.525 |
| 0.80625 | 3.525 |
| 0.8069444444444445 | 3.525 |
| 0.8076388888888889 | 3.525 |
| 0.8083333333333332 | 0 |
| 0.8090277777777778 | 3.525 |
| 0.8097222222222222 | 3.525 |
| 0.8104166666666667 | 0 |
| 0.811111111111111 | 0 |
| 0.8118055555555556 | 0 |
| 0.8125 | 0 |
| 0.8131944444444444 | 0 |
| 0.813888888888889 | 0 |
| 0.8145833333333333 | 0 |
| 0.8152777777777778 | 0 |
| 0.8159722222222222 | 0 |
| 0.8166666666666668 | 0 |
| 0.8173611111111111 | 0 |
| 0.8180555555555555 | 0 |
| 0.81875 | 0 |
| 0.8194444444444445 | 0 |
| 0.8201388888888889 | 0 |
| 0.8208333333333333 | 0 |
| 0.8215277777777777 | 0 |
| 0.8222222222222223 | 0 |
| 0.8229166666666666 | 0 |
| 0.8236111111111111 | 0 |
| 0.8243055555555556 | 0 |
| 0.8250000000000001 | 0 |
| 0.8256944444444444 | 0 |
| 0.8263888888888888 | 0 |
| 0.8270833333333334 | 0 |
| 0.8277777777777778 | 0 |
| 0.8284722222222222 | 0 |
| 0.8291666666666666 | 0 |
| 0.8298611111111112 | 0 |
| 0.8305555555555556 | 0 |
| 0.8312499999999999 | 0 |
| 0.8319444444444444 | 0 |
| 0.8326388888888889 | 0 |
| 0.8333333333333334 | 0 |
| 0.8340277777777777 | 0 |
| 0.8347222222222223 | 0 |
| 0.8354166666666667 | 0 |
| 0.8361111111111111 | 0 |
| 0.8368055555555555 | 0 |
| 0.8375 | 0 |
| 0.8381944444444445 | 0 |
| 0.8388888888888889 | 0 |
| 0.8395833333333332 | 0 |
| 0.8402777777777778 | 0 |
| 0.8409722222222222 | 0 |
| 0.8416666666666667 | 0 |
| 0.842361111111111 | 0 |
| 0.8430555555555556 | 0 |
| 0.84375 | 0 |
| 0.8444444444444444 | 0 |
| 0.845138888888889 | 0 |
| 0.8458333333333333 | 0 |
| 0.8465277777777778 | 0 |
| 0.8472222222222222 | 0 |
| 0.8479166666666668 | 0 |
| 0.8486111111111111 | 0 |
| 0.8493055555555555 | 0 |
| 0.85 | 0 |
| 0.8506944444444445 | 0 |
| 0.8513888888888889 | 0 |
| 0.8520833333333333 | 0 |
| 0.8527777777777777 | 0 |
| 0.8534722222222223 | 0 |
| 0.8541666666666666 | 0 |
| 0.8548611111111111 | 0 |
| 0.8555555555555556 | 0 |
| 0.8562500000000001 | 0 |
| 0.8569444444444444 | 0 |
| 0.8576388888888888 | 0 |
| 0.8583333333333334 | 0 |
| 0.8590277777777778 | 0 |
| 0.8597222222222222 | 0 |
| 0.8604166666666666 | 0 |
| 0.8611111111111112 | 0 |
| 0.8618055555555556 | 0 |
| 0.8624999999999999 | 0 |
| 0.8631944444444444 | 0 |
| 0.8638888888888889 | 0 |
| 0.8645833333333334 | 0 |
| 0.8652777777777777 | 0 |
| 0.8659722222222223 | 0 |
| 0.8666666666666667 | 0 |
| 0.8673611111111111 | 0 |
| 0.8680555555555555 | 0 |
| 0.86875 | 0 |
| 0.8694444444444445 | 0 |
| 0.8701388888888889 | 0 |
| 0.8708333333333332 | 0 |
| 0.8715277777777778 | 0 |
| 0.8722222222222222 | 0 |
| 0.8729166666666667 | 0 |
| 0.873611111111111 | 0 |
| 0.8743055555555556 | 0 |
| 0.875 | 0 |
| 0.8756944444444444 | 0 |
| 0.876388888888889 | 0 |
| 0.8770833333333333 | 0 |
| 0.8777777777777778 | 0 |
| 0.8784722222222222 | 0 |
| 0.8791666666666668 | 0 |
| 0.8798611111111111 | 0 |
| 0.8805555555555555 | 0 |
| 0.88125 | 0 |
| 0.8819444444444445 | 0 |
| 0.8826388888888889 | 0 |
| 0.8833333333333333 | 0 |
| 0.8840277777777777 | 0 |
| 0.8847222222222223 | 0 |
| 0.8854166666666666 | 0 |
| 0.8861111111111111 | 0 |
| 0.8868055555555556 | 0 |
| 0.8875000000000001 | 0 |
| 0.8881944444444444 | 0 |
| 0.8888888888888888 | 0 |
| 0.8895833333333334 | 0 |
| 0.8902777777777778 | 0 |
| 0.8909722222222222 | 0 |
| 0.8916666666666666 | 0 |
| 0.8923611111111112 | 0 |
| 0.8930555555555556 | 0 |
| 0.8937499999999999 | 0 |
| 0.8944444444444444 | 0 |
| 0.8951388888888889 | 0 |
| 0.8958333333333334 | 0 |
| 0.8965277777777777 | 0 |
| 0.8972222222222223 | 0 |
| 0.8979166666666667 | 0 |
| 0.8986111111111111 | 0 |
| 0.8993055555555555 | 0 |
| 0.9 | 0 |
| 0.9006944444444445 | 0 |
| 0.9013888888888889 | 0 |
| 0.9020833333333332 | 0 |
| 0.9027777777777778 | 0 |
| 0.9034722222222222 | 0 |
| 0.9041666666666667 | 0 |
| 0.904861111111111 | 0 |
| 0.9055555555555556 | 0 |
| 0.90625 | 0 |
| 0.9069444444444444 | 0 |
| 0.907638888888889 | 0 |
| 0.9083333333333333 | 0 |
| 0.9090277777777778 | 0 |
| 0.9097222222222222 | 0 |
| 0.9104166666666668 | 0 |
| 0.9111111111111111 | 0 |
| 0.9118055555555555 | 0 |
| 0.9125 | 0 |
| 0.9131944444444445 | 0 |
| 0.9138888888888889 | 0 |
| 0.9145833333333333 | 0 |
| 0.9152777777777777 | 0 |
| 0.9159722222222223 | 0 |
| 0.9166666666666666 | 0 |
| 0.9173611111111111 | 0 |
| 0.9180555555555556 | 0 |
| 0.9187500000000001 | 0 |
| 0.9194444444444444 | 0 |
| 0.9201388888888888 | 0 |
| 0.9208333333333334 | 0 |
| 0.9215277777777778 | 0 |
| 0.9222222222222222 | 0 |
| 0.9229166666666666 | 0 |
| 0.9236111111111112 | 0 |
| 0.9243055555555556 | 0 |
| 0.9249999999999999 | 0 |
| 0.9256944444444444 | 0 |
| 0.9263888888888889 | 0 |
| 0.9270833333333334 | 0 |
| 0.9277777777777777 | 0 |
| 0.9284722222222223 | 0 |
| 0.9291666666666667 | 0 |
| 0.9298611111111111 | 0 |
| 0.9305555555555555 | 0 |
| 0.93125 | 0 |
| 0.9319444444444445 | 0 |
| 0.9326388888888889 | 0 |
| 0.9333333333333332 | 0 |
| 0.9340277777777778 | 0 |
| 0.9347222222222222 | 0 |
| 0.9354166666666667 | 0 |
| 0.936111111111111 | 0 |
| 0.9368055555555556 | 0 |
| 0.9375 | 0 |
| 0.9381944444444444 | 0 |
| 0.938888888888889 | 0 |
| 0.9395833333333333 | 0 |
| 0.9402777777777778 | 0 |
| 0.9409722222222222 | 0 |
| 0.9416666666666668 | 0 |
| 0.9423611111111111 | 0 |
| 0.9430555555555555 | 0 |
| 0.94375 | 0 |
| 0.9444444444444445 | 0 |
| 0.9451388888888889 | 0 |
| 0.9458333333333333 | 0 |
| 0.9465277777777777 | 0 |
| 0.9472222222222223 | 0 |
| 0.9479166666666666 | 0 |
| 0.9486111111111111 | 0 |
| 0.9493055555555556 | 0 |
| 0.9500000000000001 | 0 |
| 0.9506944444444444 | 0 |
| 0.9513888888888888 | 0 |
| 0.9520833333333334 | 0 |
| 0.9527777777777778 | 0 |
| 0.9534722222222222 | 0 |
| 0.9541666666666666 | 0 |
| 0.9548611111111112 | 0 |
| 0.9555555555555556 | 0 |
| 0.9562499999999999 | 0 |
| 0.9569444444444444 | 0 |
| 0.9576388888888889 | 0 |
| 0.9583333333333334 | 0 |
| 0.9590277777777777 | 0 |
| 0.9597222222222223 | 0 |
| 0.9604166666666667 | 0 |
| 0.9611111111111111 | 0 |
| 0.9618055555555555 | 0 |
| 0.9625 | 0 |
| 0.9631944444444445 | 0 |
| 0.9638888888888889 | 0 |
| 0.9645833333333332 | 0 |
| 0.9652777777777778 | 0 |
| 0.9659722222222222 | 0 |
| 0.9666666666666667 | 0 |
| 0.967361111111111 | 0 |
| 0.9680555555555556 | 0 |
| 0.96875 | 0 |
| 0.9694444444444444 | 0 |
| 0.970138888888889 | 0 |
| 0.9708333333333333 | 0 |
| 0.9715277777777778 | 0 |
| 0.9722222222222222 | 0 |
| 0.9729166666666668 | 0 |
| 0.9736111111111111 | 0 |
| 0.9743055555555555 | 0 |
| 0.975 | 0 |
| 0.9756944444444445 | 0 |
| 0.9763888888888889 | 0 |
| 0.9770833333333333 | 0 |
| 0.9777777777777777 | 0 |
| 0.9784722222222223 | 0 |
| 0.9791666666666666 | 0 |
| 0.9798611111111111 | 0 |
| 0.9805555555555556 | 0 |
| 0.9812500000000001 | 0 |
| 0.9819444444444444 | 0 |
| 0.9826388888888888 | 0 |
| 0.9833333333333334 | 0 |
| 0.9840277777777778 | 0 |
| 0.9847222222222222 | 0 |
| 0.9854166666666666 | 0 |
| 0.9861111111111112 | 0 |
| 0.9868055555555556 | 0 |
| 0.9874999999999999 | 0 |
| 0.9881944444444444 | 0 |
| 0.9888888888888889 | 0 |
| 0.9895833333333334 | 0 |
| 0.9902777777777777 | 0 |
| 0.9909722222222223 | 0 |
| 0.9916666666666667 | 0 |
| 0.9923611111111111 | 0 |
| 0.9930555555555555 | 0 |
| 0.99375 | 0 |
| 0.9944444444444445 | 0 |
| 0.9951388888888889 | 0 |
| 0.9958333333333332 | 0 |
| 0.9965277777777778 | 0 |
| 0.9972222222222222 | 0 |
| 0.9979166666666667 | 0 |
| 0.998611111111111 | 0 |
| 0.9993055555555556 | 0 |